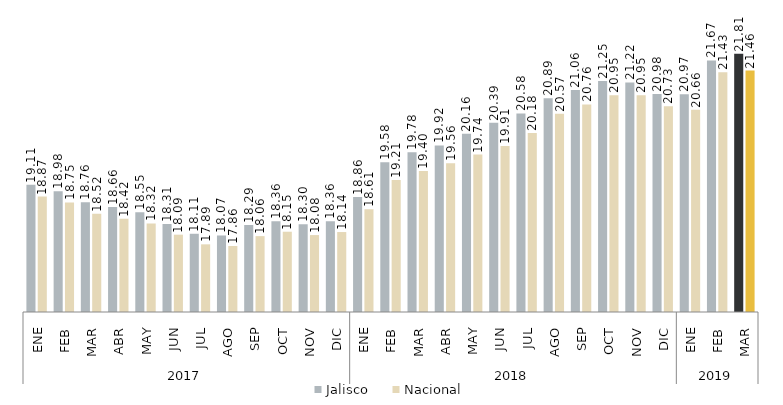
| Category | Jalisco | Nacional |
|---|---|---|
| 0 | 19.114 | 18.871 |
| 1 | 18.982 | 18.752 |
| 2 | 18.757 | 18.517 |
| 3 | 18.658 | 18.418 |
| 4 | 18.549 | 18.32 |
| 5 | 18.307 | 18.089 |
| 6 | 18.107 | 17.89 |
| 7 | 18.072 | 17.856 |
| 8 | 18.285 | 18.059 |
| 9 | 18.363 | 18.149 |
| 10 | 18.303 | 18.081 |
| 11 | 18.364 | 18.143 |
| 12 | 18.864 | 18.613 |
| 13 | 19.575 | 19.21 |
| 14 | 19.782 | 19.398 |
| 15 | 19.923 | 19.557 |
| 16 | 20.164 | 19.736 |
| 17 | 20.389 | 19.91 |
| 18 | 20.58 | 20.176 |
| 19 | 20.893 | 20.574 |
| 20 | 21.062 | 20.764 |
| 21 | 21.249 | 20.953 |
| 22 | 21.216 | 20.954 |
| 23 | 20.977 | 20.726 |
| 24 | 20.975 | 20.655 |
| 25 | 21.67 | 21.427 |
| 26 | 21.806 | 21.46 |